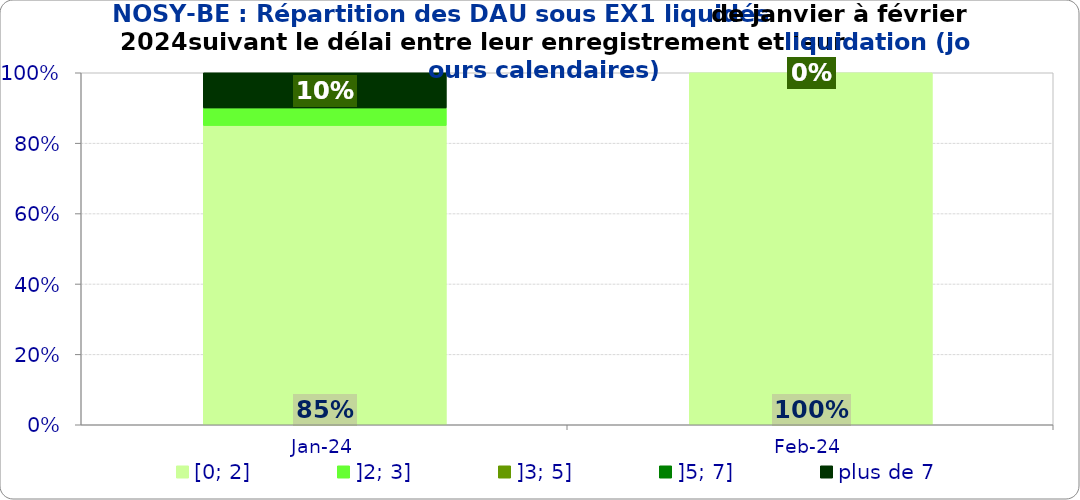
| Category | [0; 2] | ]2; 3] | ]3; 5] | ]5; 7] | plus de 7 |
|---|---|---|---|---|---|
| 2024-01-01 | 0.85 | 0.05 | 0 | 0 | 0.1 |
| 2024-02-01 | 1 | 0 | 0 | 0 | 0 |